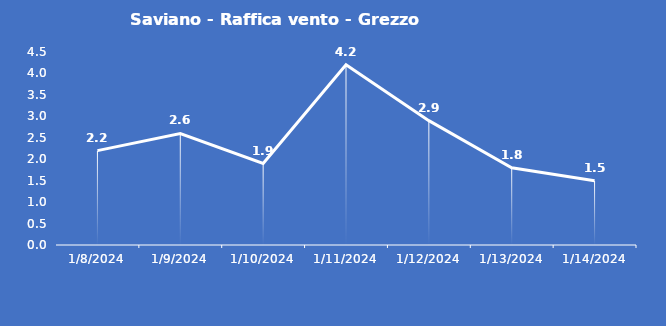
| Category | Saviano - Raffica vento - Grezzo (m/s) |
|---|---|
| 1/8/24 | 2.2 |
| 1/9/24 | 2.6 |
| 1/10/24 | 1.9 |
| 1/11/24 | 4.2 |
| 1/12/24 | 2.9 |
| 1/13/24 | 1.8 |
| 1/14/24 | 1.5 |